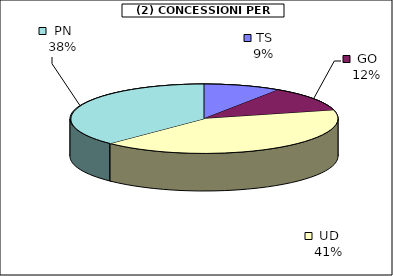
| Category | Series 0 |
|---|---|
| TS | 17157.125 |
| GO | 21399.5 |
| UD | 75412 |
| PN | 68770.5 |